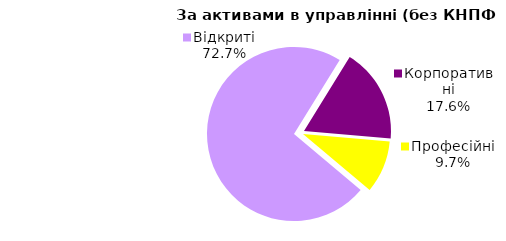
| Category | Series 0 |
|---|---|
| Відкриті | 991.538 |
| Корпоративні | 239.869 |
| Професійні | 132.731 |